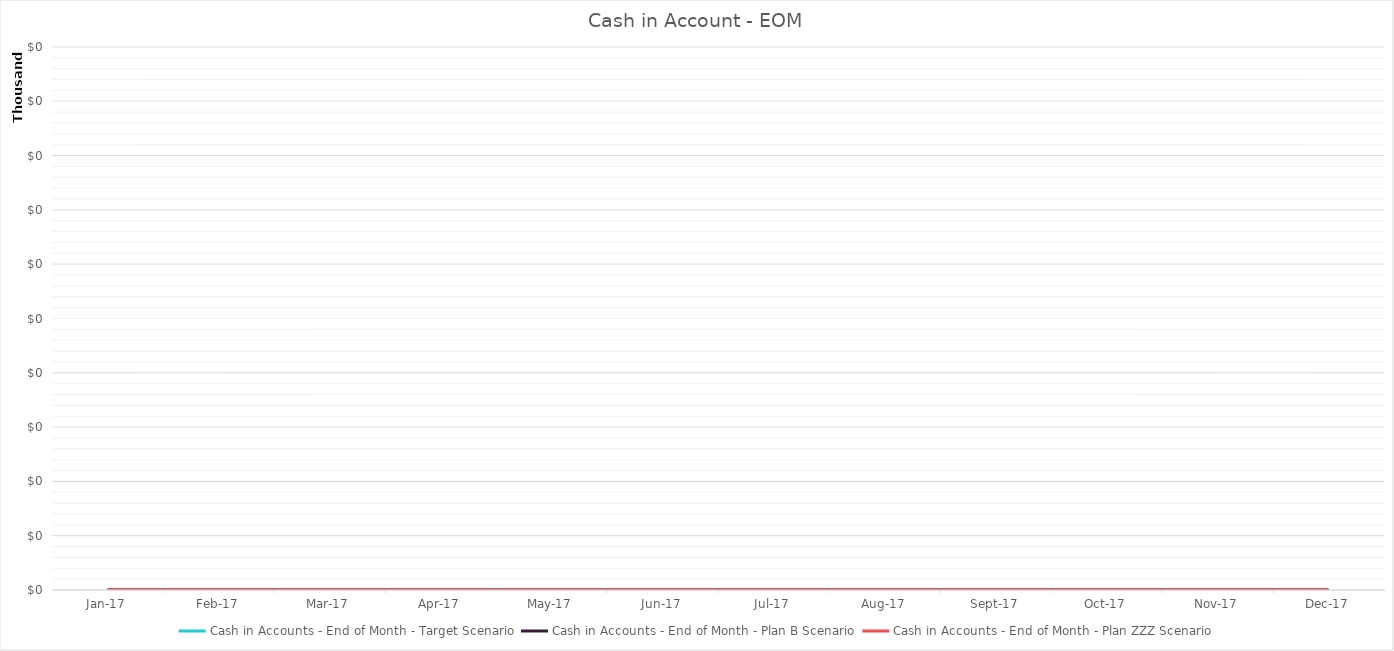
| Category | Cash in Accounts - End of Month - Target Scenario | Cash in Accounts - End of Month - Plan B Scenario | Cash in Accounts - End of Month - Plan ZZZ Scenario |
|---|---|---|---|
| Jan-17 | 0 | 0 | 0 |
| Feb-17 | 0 | 0 | 0 |
| Mar-17 | 0 | 0 | 0 |
| Apr-17 | 0 | 0 | 0 |
| May-17 | 0 | 0 | 0 |
| Jun-17 | 0 | 0 | 0 |
| Jul-17 | 0 | 0 | 0 |
| Aug-17 | 0 | 0 | 0 |
| Sep-17 | 0 | 0 | 0 |
| Oct-17 | 0 | 0 | 0 |
| Nov-17 | 0 | 0 | 0 |
| Dec-17 | 0 | 0 | 0 |